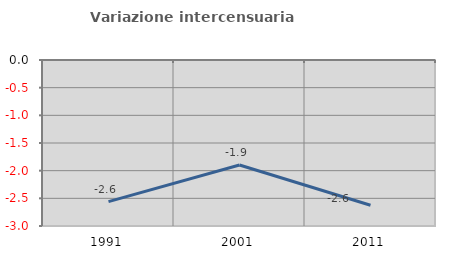
| Category | Variazione intercensuaria annua |
|---|---|
| 1991.0 | -2.56 |
| 2001.0 | -1.897 |
| 2011.0 | -2.626 |